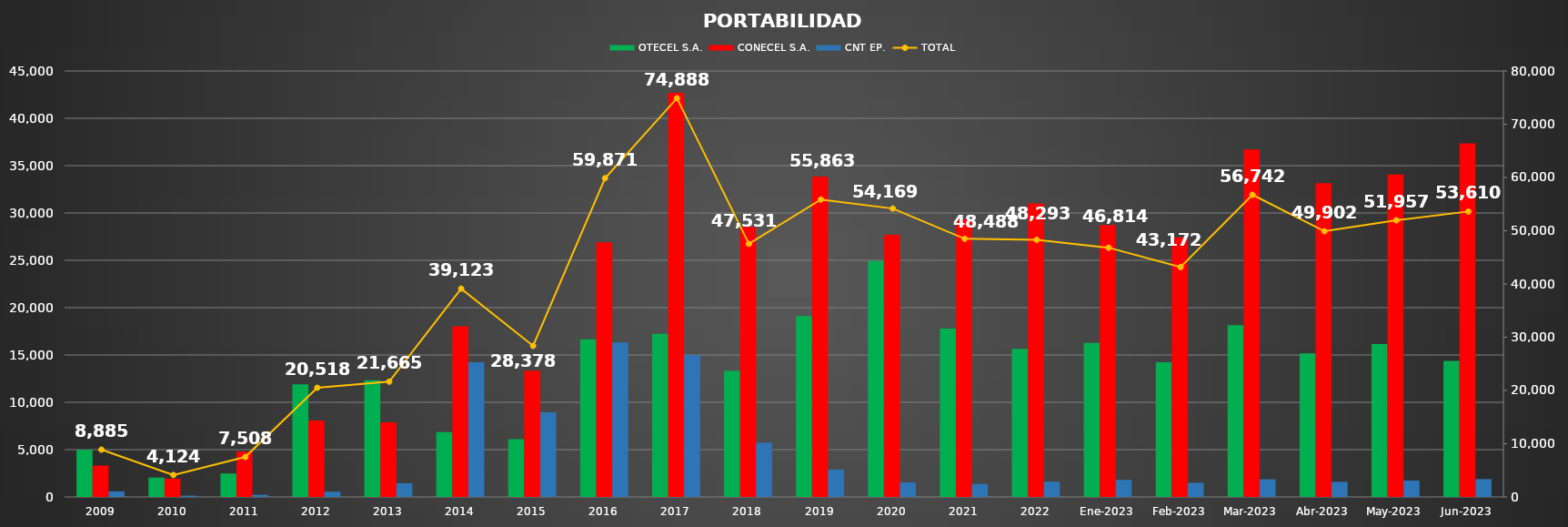
| Category | OTECEL S.A. | CONECEL S.A. | CNT EP. |
|---|---|---|---|
| 2009 | 4973 | 3324 | 588 |
| 2010 | 2045 | 1939 | 140 |
| 2011 | 2484 | 4796 | 228 |
| 2012 | 11894 | 8067 | 557 |
| 2013 | 12323 | 7893 | 1449 |
| 2014 | 6853 | 18039 | 14231 |
| 2015 | 6105 | 13334 | 8939 |
| 2016 | 16653 | 26907 | 16311 |
| 2017 | 17228 | 42694 | 14966 |
| 2018 | 13309 | 28504 | 5718 |
| 2019 | 19116 | 33857 | 2890 |
| 2020 | 24933 | 27700 | 1536 |
| 2021 | 17795 | 29321 | 1372 |
| 2022 | 15655 | 31012 | 1626 |
| Ene-2023 | 16278 | 28730 | 1806 |
| Feb-2023 | 14237 | 27438 | 1497 |
| Mar-2023 | 18159 | 36713 | 1870 |
| Abr-2023 | 15167 | 33140 | 1595 |
| May-2023 | 16147 | 34074 | 1736 |
| Jun-2023 | 14369 | 37353 | 1888 |